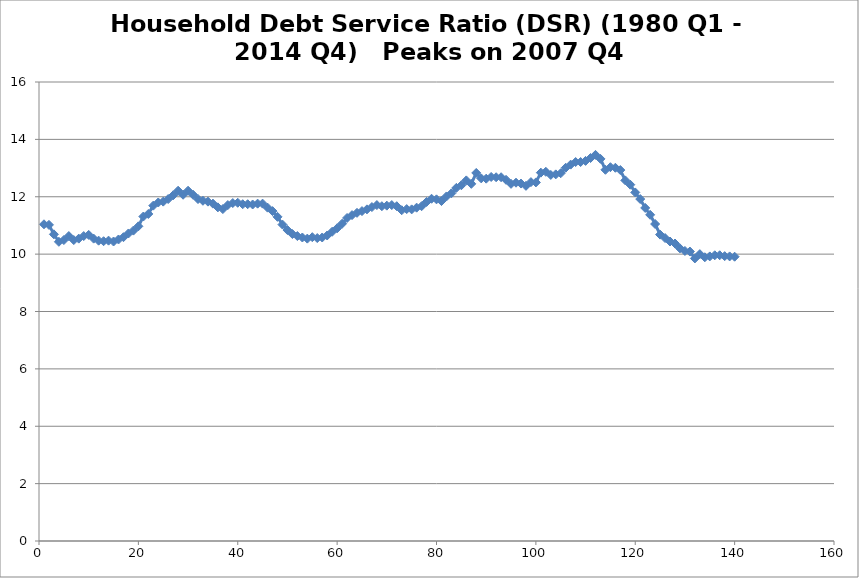
| Category | DSR |
|---|---|
| 0 | 11.04 |
| 1 | 11.02 |
| 2 | 10.69 |
| 3 | 10.43 |
| 4 | 10.49 |
| 5 | 10.63 |
| 6 | 10.49 |
| 7 | 10.54 |
| 8 | 10.63 |
| 9 | 10.67 |
| 10 | 10.54 |
| 11 | 10.47 |
| 12 | 10.45 |
| 13 | 10.47 |
| 14 | 10.44 |
| 15 | 10.51 |
| 16 | 10.59 |
| 17 | 10.72 |
| 18 | 10.82 |
| 19 | 10.97 |
| 20 | 11.31 |
| 21 | 11.4 |
| 22 | 11.69 |
| 23 | 11.8 |
| 24 | 11.83 |
| 25 | 11.92 |
| 26 | 12.05 |
| 27 | 12.21 |
| 28 | 12.07 |
| 29 | 12.21 |
| 30 | 12.07 |
| 31 | 11.92 |
| 32 | 11.86 |
| 33 | 11.83 |
| 34 | 11.76 |
| 35 | 11.63 |
| 36 | 11.57 |
| 37 | 11.71 |
| 38 | 11.78 |
| 39 | 11.79 |
| 40 | 11.74 |
| 41 | 11.74 |
| 42 | 11.73 |
| 43 | 11.76 |
| 44 | 11.76 |
| 45 | 11.62 |
| 46 | 11.5 |
| 47 | 11.3 |
| 48 | 11.03 |
| 49 | 10.84 |
| 50 | 10.7 |
| 51 | 10.63 |
| 52 | 10.58 |
| 53 | 10.54 |
| 54 | 10.59 |
| 55 | 10.56 |
| 56 | 10.58 |
| 57 | 10.65 |
| 58 | 10.78 |
| 59 | 10.9 |
| 60 | 11.06 |
| 61 | 11.26 |
| 62 | 11.36 |
| 63 | 11.44 |
| 64 | 11.5 |
| 65 | 11.56 |
| 66 | 11.64 |
| 67 | 11.71 |
| 68 | 11.67 |
| 69 | 11.69 |
| 70 | 11.71 |
| 71 | 11.67 |
| 72 | 11.53 |
| 73 | 11.57 |
| 74 | 11.56 |
| 75 | 11.62 |
| 76 | 11.67 |
| 77 | 11.82 |
| 78 | 11.93 |
| 79 | 11.91 |
| 80 | 11.85 |
| 81 | 12.01 |
| 82 | 12.12 |
| 83 | 12.31 |
| 84 | 12.4 |
| 85 | 12.57 |
| 86 | 12.45 |
| 87 | 12.83 |
| 88 | 12.64 |
| 89 | 12.63 |
| 90 | 12.69 |
| 91 | 12.68 |
| 92 | 12.68 |
| 93 | 12.59 |
| 94 | 12.45 |
| 95 | 12.49 |
| 96 | 12.46 |
| 97 | 12.38 |
| 98 | 12.51 |
| 99 | 12.5 |
| 100 | 12.84 |
| 101 | 12.87 |
| 102 | 12.76 |
| 103 | 12.78 |
| 104 | 12.82 |
| 105 | 13.01 |
| 106 | 13.12 |
| 107 | 13.21 |
| 108 | 13.21 |
| 109 | 13.25 |
| 110 | 13.35 |
| 111 | 13.46 |
| 112 | 13.32 |
| 113 | 12.94 |
| 114 | 13.03 |
| 115 | 13.01 |
| 116 | 12.93 |
| 117 | 12.57 |
| 118 | 12.42 |
| 119 | 12.15 |
| 120 | 11.92 |
| 121 | 11.61 |
| 122 | 11.37 |
| 123 | 11.05 |
| 124 | 10.68 |
| 125 | 10.56 |
| 126 | 10.44 |
| 127 | 10.37 |
| 128 | 10.2 |
| 129 | 10.11 |
| 130 | 10.09 |
| 131 | 9.85 |
| 132 | 10 |
| 133 | 9.89 |
| 134 | 9.92 |
| 135 | 9.96 |
| 136 | 9.96 |
| 137 | 9.93 |
| 138 | 9.92 |
| 139 | 9.91 |